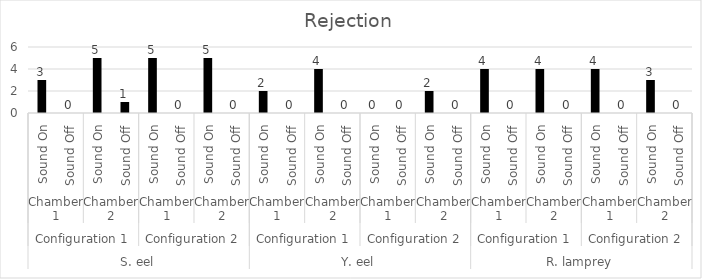
| Category | Rejection |
|---|---|
| 0 | 3 |
| 1 | 0 |
| 2 | 5 |
| 3 | 1 |
| 4 | 5 |
| 5 | 0 |
| 6 | 5 |
| 7 | 0 |
| 8 | 2 |
| 9 | 0 |
| 10 | 4 |
| 11 | 0 |
| 12 | 0 |
| 13 | 0 |
| 14 | 2 |
| 15 | 0 |
| 16 | 4 |
| 17 | 0 |
| 18 | 4 |
| 19 | 0 |
| 20 | 4 |
| 21 | 0 |
| 22 | 3 |
| 23 | 0 |